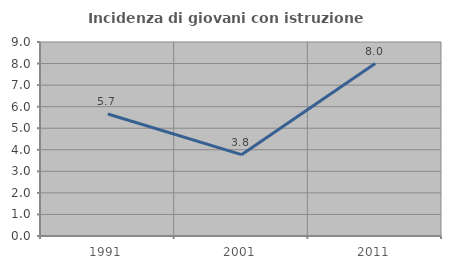
| Category | Incidenza di giovani con istruzione universitaria |
|---|---|
| 1991.0 | 5.66 |
| 2001.0 | 3.774 |
| 2011.0 | 8 |